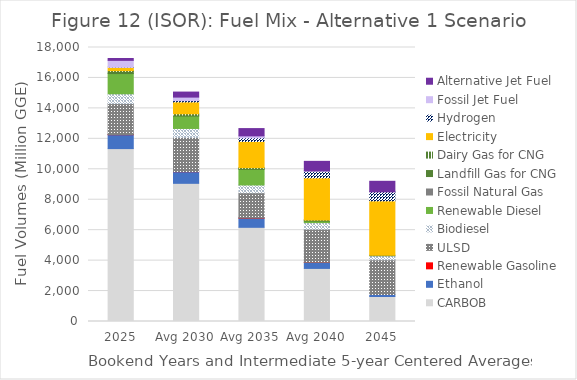
| Category | CARBOB | Ethanol | Renewable Gasoline | ULSD | Biodiesel | Renewable Diesel | Fossil Natural Gas | Landfill Gas for CNG | Dairy Gas for CNG | Electricity | Hydrogen | Fossil Jet Fuel | Alternative Jet Fuel |
|---|---|---|---|---|---|---|---|---|---|---|---|---|---|
| 2025 | 11358.924 | 913.355 | 12.959 | 2030.563 | 644.244 | 1326.709 | 0 | 144.467 | 49.404 | 213.013 | 5.314 | 455.722 | 120.981 |
| Avg 2030 | 9076.828 | 765.54 | 7.936 | 2244.663 | 586.649 | 812.473 | 0 | 73.799 | 78.374 | 777.105 | 87.448 | 230.75 | 330.564 |
| Avg 2035 | 6187.353 | 608.043 | 9.978 | 1650.797 | 512.807 | 1021.532 | 0 | 73.799 | 42.77 | 1722.918 | 241.867 | 122.663 | 478.761 |
| Avg 2040 | 3486.91 | 404.539 | 0.97 | 2173.187 | 433.271 | 99.261 | 0 | 67.655 | 5.281 | 2762.485 | 436.496 | 22.955 | 627.587 |
| 2045 | 1643.164 | 124.439 | 0 | 2285.167 | 264.17 | 0 | 0 | 32.937 | 0 | 3572.892 | 592.954 | 0 | 694.722 |